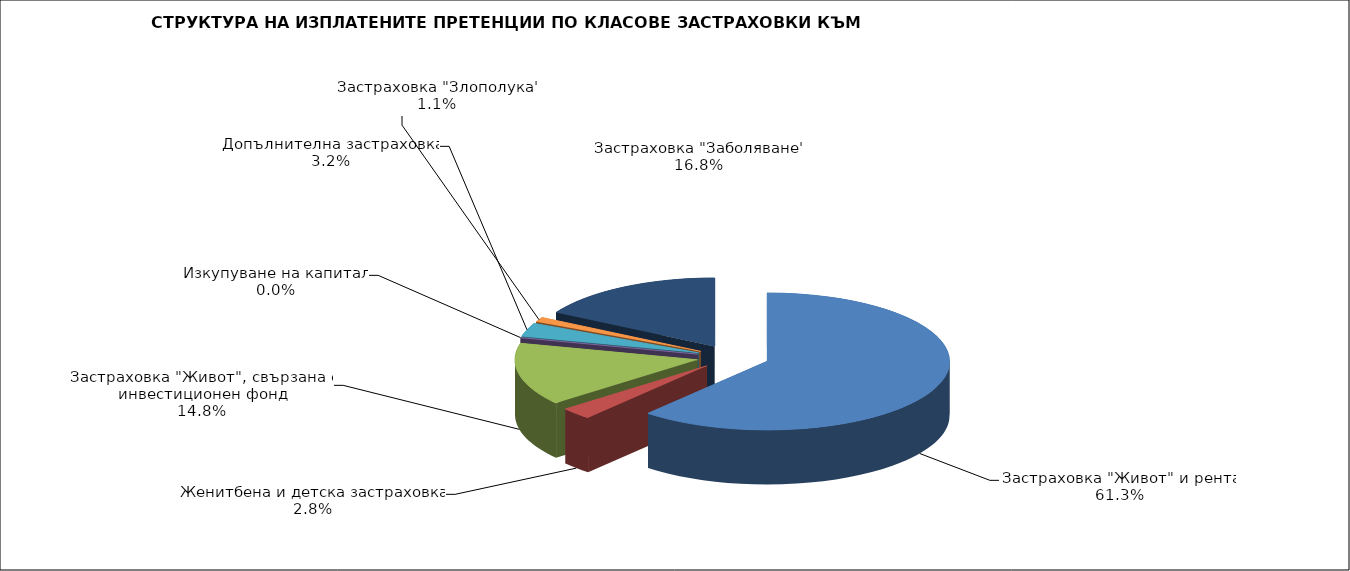
| Category | 37 702 995 |
|---|---|
| Застраховка "Живот" и рента | 37702994.659 |
| Женитбена и детска застраховка | 1736064.566 |
| Застраховка "Живот", свързана с инвестиционен фонд | 9084439.593 |
| Изкупуване на капитал | 0 |
| Допълнителна застраховка | 1981535.414 |
| Застраховка "Злополука" | 698785.873 |
| Застраховка "Заболяване" | 10312905.166 |